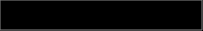
| Category | Series 0 |
|---|---|
| 0 | 0.108 |
| 1 | 0.838 |
| 2 | 0.053 |